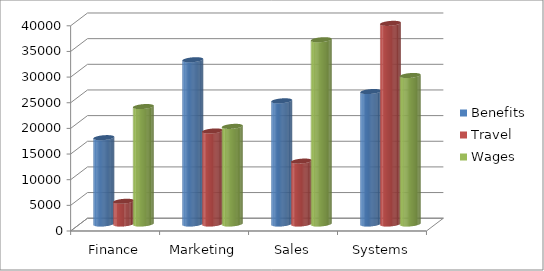
| Category | Benefits | Travel | Wages |
|---|---|---|---|
| Finance | 16829.5 | 4427.45 | 22891.55 |
| Marketing | 32014.23 | 18132 | 19029.36 |
| Sales | 24010.25 | 12259.25 | 35919.3 |
| Systems | 25819.34 | 39109.23 | 28945.1 |